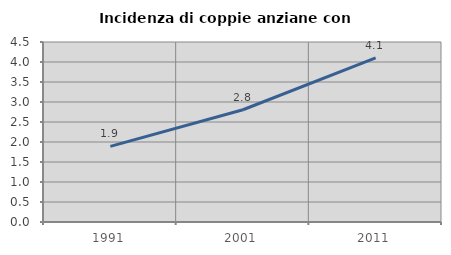
| Category | Incidenza di coppie anziane con figli |
|---|---|
| 1991.0 | 1.89 |
| 2001.0 | 2.806 |
| 2011.0 | 4.103 |